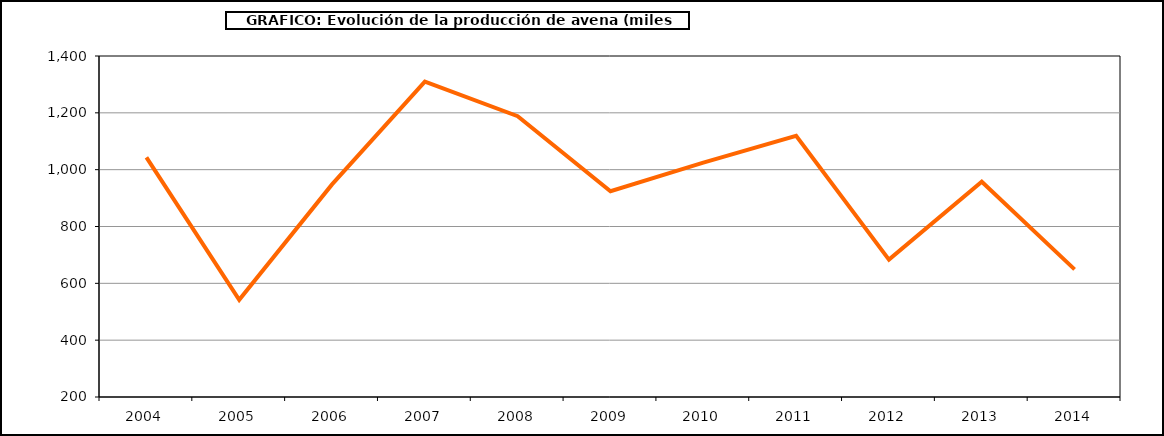
| Category | Superficie |
|---|---|
| 2004.0 | 1042.975 |
| 2005.0 | 542.108 |
| 2006.0 | 948.115 |
| 2007.0 | 1309.945 |
| 2008.0 | 1188.33 |
| 2009.0 | 923.946 |
| 2010.0 | 1024.661 |
| 2011.0 | 1119.214 |
| 2012.0 | 683.482 |
| 2013.0 | 957.662 |
| 2014.0 | 649.194 |